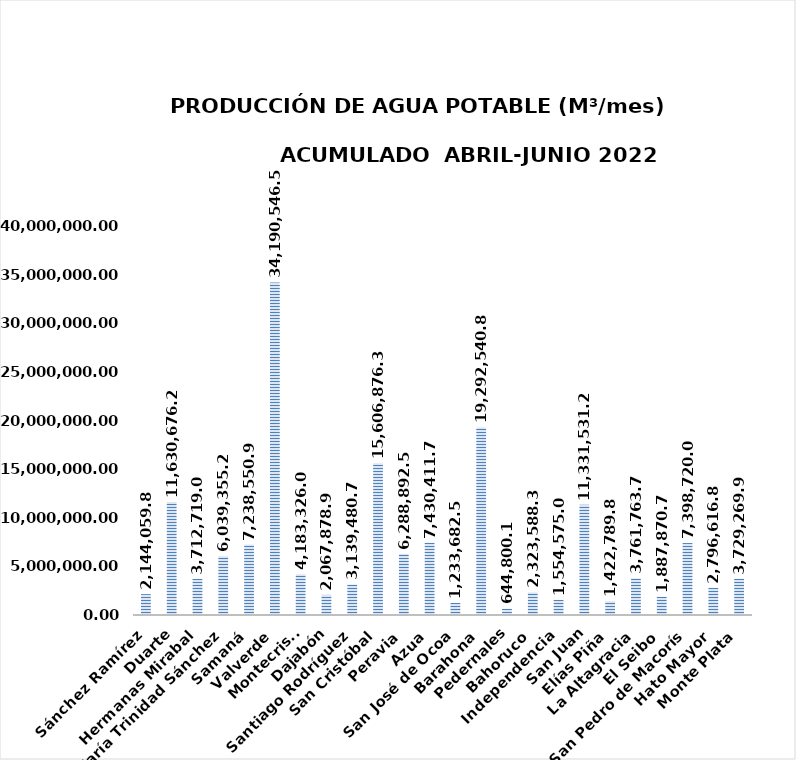
| Category | 2,144,059.85 |
|---|---|
| Sánchez Ramírez | 2144059.852 |
| Duarte | 11630676.28 |
| Hermanas Mirabal | 3712719.014 |
| María Trinidad Sánchez | 6039355.258 |
| Samaná | 7238550.964 |
| Valverde | 34190546.548 |
| Montecristi | 4183326 |
| Dajabón | 2067878.968 |
| Santiago Rodríguez | 3139480.782 |
| San Cristóbal | 15606876.326 |
| Peravia | 6288892.534 |
| Azua | 7430411.748 |
| San José de Ocoa | 1233682.502 |
| Barahona | 19292540.828 |
| Pedernales | 644800.16 |
| Bahoruco | 2323588.32 |
| Independencia | 1554575.014 |
| San Juan | 11331531.272 |
| Elías Piña | 1422789.86 |
| La Altagracia | 3761763.696 |
| El Seibo | 1887870.766 |
| San Pedro de Macorís | 7398720 |
| Hato Mayor | 2796616.8 |
| Monte Plata | 3729269.948 |